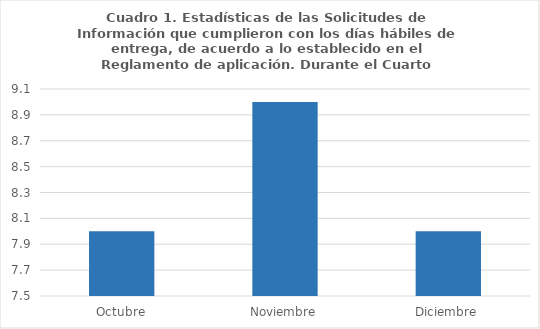
| Category | Series 0 |
|---|---|
| Octubre | 8 |
| Noviembre | 9 |
| Diciembre | 8 |